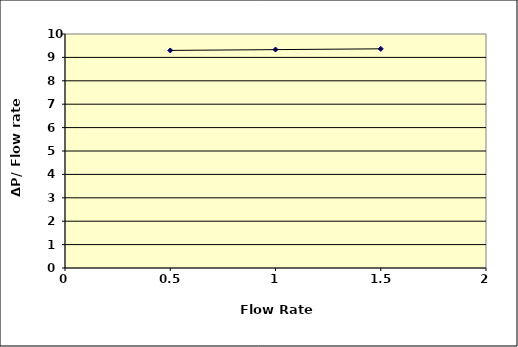
| Category | Series 0 |
|---|---|
| nan | 0 |
| 0.5 | 9.297 |
| 1.0 | 9.337 |
| 1.5 | 9.364 |